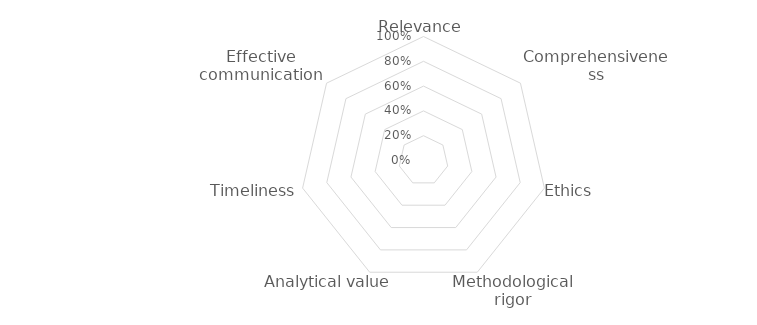
| Category | Series 0 |
|---|---|
| Relevance | 0 |
| Comprehensiveness | 0 |
| Ethics | 0 |
| Methodological rigor | 0 |
| Analytical value | 0 |
| Timeliness | 0 |
| Effective communication | 0 |